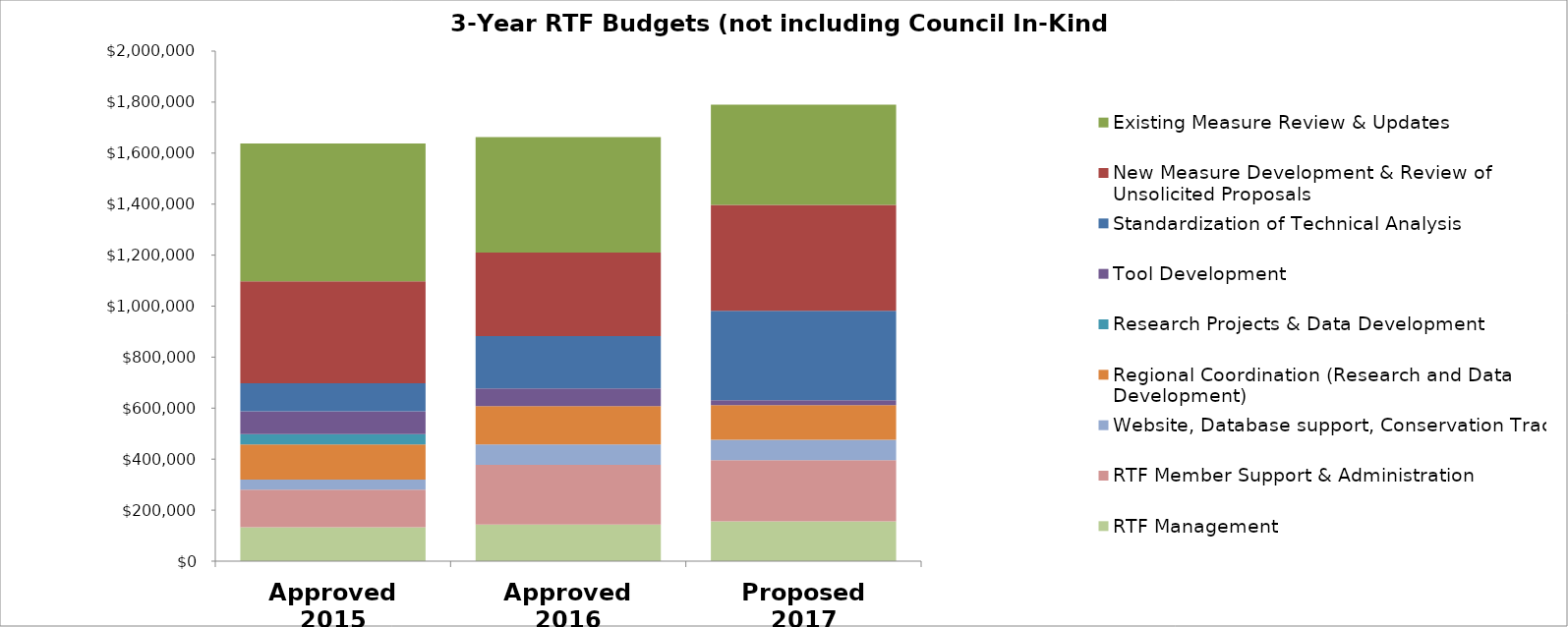
| Category | RTF Management | RTF Member Support & Administration | Website, Database support, Conservation Tracking  | Regional Coordination (Research and Data Development) | Research Projects & Data Development | Tool Development | Standardization of Technical Analysis | New Measure Development & Review of Unsolicited Proposals | Existing Measure Review & Updates |
|---|---|---|---|---|---|---|---|---|---|
| Approved 2015 | 133300 | 146800 | 40000 | 137500 | 40000 | 90500 | 109000 | 400000 | 540500 |
| Approved 2016 | 143300 | 234200 | 80000 | 150000 | 0 | 70000 | 205000 | 328000 | 452500 |
| Proposed 2017 | 156300 | 240000 | 80000 | 135000 | 0 | 20000 | 350000 | 415500 | 393000 |